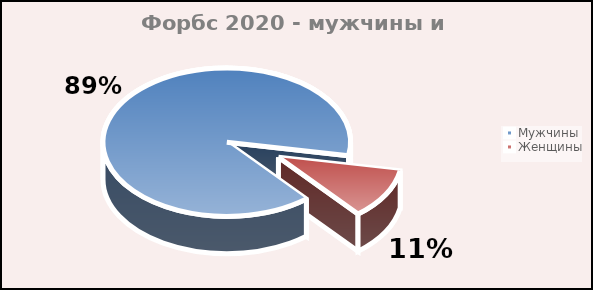
| Category | Series 0 |
|---|---|
| Мужчины | 2100 |
| Женщины | 259 |